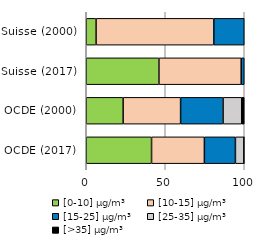
| Category | [0-10] µg/m³ | [10-15] µg/m³ | [15-25] µg/m³ | [25-35] µg/m³ | [>35] µg/m³ |
|---|---|---|---|---|---|
| OCDE (2017) | 41.332 | 33.433 | 19.644 | 5.4 | 0.2 |
| OCDE (2000) | 23.345 | 36.368 | 26.895 | 11.8 | 1.6 |
| Suisse (2017) | 45.998 | 52.08 | 1.922 | 0 | 0 |
| Suisse (2000) | 6.213 | 74.513 | 19.274 | 0 | 0 |